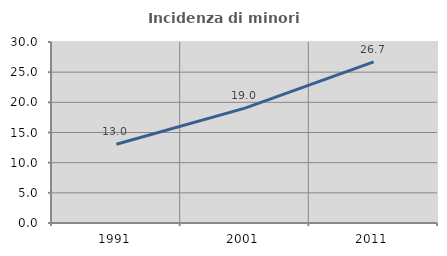
| Category | Incidenza di minori stranieri |
|---|---|
| 1991.0 | 13.043 |
| 2001.0 | 19.035 |
| 2011.0 | 26.715 |